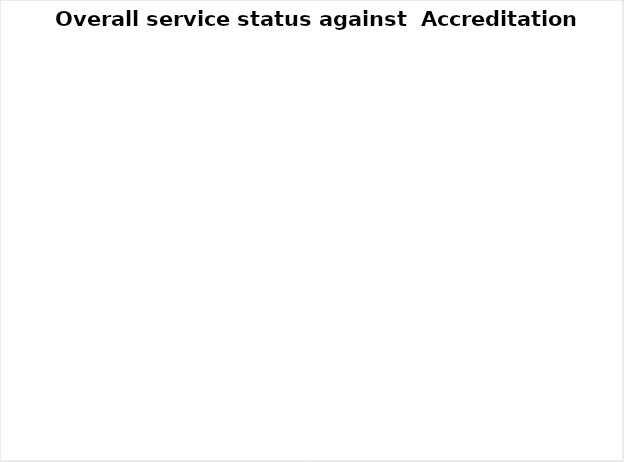
| Category | Series 0 |
|---|---|
| Not present | 0 |
| Partially present | 0 |
| Present | 0 |
| Don’t know | 0 |